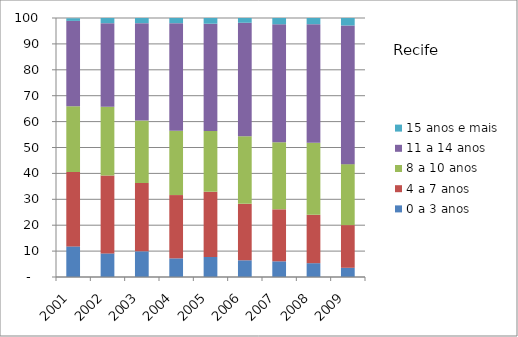
| Category | 0 a 3 anos | 4 a 7 anos | 8 a 10 anos | 11 a 14 anos | 15 anos e mais |
|---|---|---|---|---|---|
| 2001.0 | 11.82 | 28.71 | 25.37 | 32.99 | 1 |
| 2002.0 | 9.12 | 30.08 | 26.5 | 32.3 | 2 |
| 2003.0 | 9.9 | 26.4 | 24.11 | 37.6 | 1.99 |
| 2004.0 | 7.2 | 24.43 | 24.84 | 41.53 | 2 |
| 2005.0 | 7.72 | 25.21 | 23.46 | 41.4 | 2.21 |
| 2006.0 | 6.46 | 21.79 | 26.05 | 43.86 | 1.84 |
| 2007.0 | 6.06 | 20.07 | 25.93 | 45.52 | 2.42 |
| 2008.0 | 5.34 | 18.68 | 27.86 | 45.73 | 2.4 |
| 2009.0 | 3.56 | 16.48 | 23.54 | 53.53 | 2.9 |